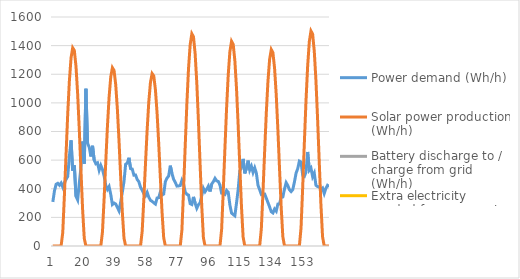
| Category | Power demand (Wh/h) | Solar power production (Wh/h) | Battery discharge to / charge from grid (Wh/h) | Extra electricity needed from generator (Wh/h) |
|---|---|---|---|---|
| 0 | 307.889 | 0 |  |  |
| 1 | 386 | 0 |  |  |
| 2 | 431.333 | 0 |  |  |
| 3 | 438 | 0 |  |  |
| 4 | 424.667 | 0 |  |  |
| 5 | 440.111 | 0 |  |  |
| 6 | 411.667 | 93.6 |  |  |
| 7 | 444.444 | 355.2 |  |  |
| 8 | 465 | 643.2 |  |  |
| 9 | 486.111 | 921.6 |  |  |
| 10 | 627.333 | 1152 |  |  |
| 11 | 737.778 | 1312.8 |  |  |
| 12 | 526.444 | 1384.8 |  |  |
| 13 | 563.556 | 1365.6 |  |  |
| 14 | 346.556 | 1255.2 |  |  |
| 15 | 322.222 | 1063.2 |  |  |
| 16 | 439.444 | 811.2 |  |  |
| 17 | 549.778 | 528 |  |  |
| 18 | 729.778 | 254.4 |  |  |
| 19 | 575.556 | 52.8 |  |  |
| 20 | 1099 | 0 |  |  |
| 21 | 717.222 | 0 |  |  |
| 22 | 690 | 0 |  |  |
| 23 | 625.556 | 0 |  |  |
| 24 | 700.222 | 0 |  |  |
| 25 | 599.667 | 0 |  |  |
| 26 | 574.667 | 0 |  |  |
| 27 | 581 | 0 |  |  |
| 28 | 529.444 | 0 |  |  |
| 29 | 563.222 | 0 |  |  |
| 30 | 534.556 | 98.4 |  |  |
| 31 | 488.889 | 331.2 |  |  |
| 32 | 423.444 | 590.4 |  |  |
| 33 | 395.667 | 835.2 |  |  |
| 34 | 415.111 | 1039.2 |  |  |
| 35 | 360.556 | 1180.8 |  |  |
| 36 | 290 | 1245.6 |  |  |
| 37 | 300.111 | 1226.4 |  |  |
| 38 | 293.222 | 1128 |  |  |
| 39 | 269.889 | 957.6 |  |  |
| 40 | 245.667 | 734.4 |  |  |
| 41 | 307.222 | 484.8 |  |  |
| 42 | 375.889 | 237.6 |  |  |
| 43 | 449.778 | 55.2 |  |  |
| 44 | 571.556 | 0 |  |  |
| 45 | 579.222 | 0 |  |  |
| 46 | 616.444 | 0 |  |  |
| 47 | 540.222 | 0 |  |  |
| 48 | 537.444 | 0 |  |  |
| 49 | 495 | 0 |  |  |
| 50 | 495.778 | 0 |  |  |
| 51 | 464.556 | 0 |  |  |
| 52 | 448.778 | 0 |  |  |
| 53 | 410.333 | 0 |  |  |
| 54 | 390.222 | 103.2 |  |  |
| 55 | 365.222 | 328.8 |  |  |
| 56 | 350.444 | 576 |  |  |
| 57 | 374.556 | 811.2 |  |  |
| 58 | 341.111 | 1008 |  |  |
| 59 | 319 | 1142.4 |  |  |
| 60 | 312.444 | 1204.8 |  |  |
| 61 | 301.444 | 1188 |  |  |
| 62 | 292.778 | 1092 |  |  |
| 63 | 335.222 | 928.8 |  |  |
| 64 | 338 | 715.2 |  |  |
| 65 | 378.556 | 472.8 |  |  |
| 66 | 356 | 237.6 |  |  |
| 67 | 362.889 | 57.6 |  |  |
| 68 | 449.667 | 0 |  |  |
| 69 | 474.667 | 0 |  |  |
| 70 | 488.778 | 0 |  |  |
| 71 | 561.222 | 0 |  |  |
| 72 | 506.222 | 0 |  |  |
| 73 | 466 | 0 |  |  |
| 74 | 444.778 | 0 |  |  |
| 75 | 418.556 | 0 |  |  |
| 76 | 419.667 | 0 |  |  |
| 77 | 422.333 | 0 |  |  |
| 78 | 458.667 | 110.4 |  |  |
| 79 | 432 | 391.2 |  |  |
| 80 | 377.444 | 698.4 |  |  |
| 81 | 361 | 993.6 |  |  |
| 82 | 355.778 | 1238.4 |  |  |
| 83 | 295.667 | 1406.4 |  |  |
| 84 | 289.889 | 1483.2 |  |  |
| 85 | 343 | 1461.6 |  |  |
| 86 | 299 | 1344 |  |  |
| 87 | 263.778 | 1140 |  |  |
| 88 | 288.667 | 871.2 |  |  |
| 89 | 301.333 | 571.2 |  |  |
| 90 | 352.556 | 278.4 |  |  |
| 91 | 402.889 | 57.6 |  |  |
| 92 | 379.222 | 0 |  |  |
| 93 | 396.778 | 0 |  |  |
| 94 | 418.444 | 0 |  |  |
| 95 | 381 | 0 |  |  |
| 96 | 433.111 | 0 |  |  |
| 97 | 449.333 | 0 |  |  |
| 98 | 472.556 | 0 |  |  |
| 99 | 455.111 | 0 |  |  |
| 100 | 450.889 | 0 |  |  |
| 101 | 426 | 0 |  |  |
| 102 | 369.222 | 115.2 |  |  |
| 103 | 366.222 | 384 |  |  |
| 104 | 359.889 | 681.6 |  |  |
| 105 | 388.222 | 962.4 |  |  |
| 106 | 375.667 | 1195.2 |  |  |
| 107 | 287.222 | 1358.4 |  |  |
| 108 | 230.444 | 1430.4 |  |  |
| 109 | 219.889 | 1408.8 |  |  |
| 110 | 211 | 1296 |  |  |
| 111 | 299.444 | 1101.6 |  |  |
| 112 | 394.333 | 844.8 |  |  |
| 113 | 524.222 | 556.8 |  |  |
| 114 | 548.556 | 276 |  |  |
| 115 | 608.667 | 62.4 |  |  |
| 116 | 507.556 | 0 |  |  |
| 117 | 541.889 | 0 |  |  |
| 118 | 596.778 | 0 |  |  |
| 119 | 530.444 | 0 |  |  |
| 120 | 557.333 | 0 |  |  |
| 121 | 514 | 0 |  |  |
| 122 | 546 | 0 |  |  |
| 123 | 509.111 | 0 |  |  |
| 124 | 423.889 | 0 |  |  |
| 125 | 393.111 | 0 |  |  |
| 126 | 360.111 | 120 |  |  |
| 127 | 364 | 376.8 |  |  |
| 128 | 364 | 660 |  |  |
| 129 | 334.222 | 928.8 |  |  |
| 130 | 303.556 | 1149.6 |  |  |
| 131 | 273.556 | 1303.2 |  |  |
| 132 | 239.556 | 1372.8 |  |  |
| 133 | 231.111 | 1351.2 |  |  |
| 134 | 258.333 | 1243.2 |  |  |
| 135 | 243.556 | 1058.4 |  |  |
| 136 | 293 | 813.6 |  |  |
| 137 | 295.444 | 540 |  |  |
| 138 | 339.444 | 271.2 |  |  |
| 139 | 342.778 | 64.8 |  |  |
| 140 | 398.222 | 0 |  |  |
| 141 | 442.556 | 0 |  |  |
| 142 | 422.556 | 0 |  |  |
| 143 | 393 | 0 |  |  |
| 144 | 380.111 | 0 |  |  |
| 145 | 394 | 0 |  |  |
| 146 | 446.889 | 0 |  |  |
| 147 | 509 | 0 |  |  |
| 148 | 540.556 | 0 |  |  |
| 149 | 593.111 | 0 |  |  |
| 150 | 586.778 | 127.2 |  |  |
| 151 | 493.889 | 410.4 |  |  |
| 152 | 486.222 | 720 |  |  |
| 153 | 515.889 | 1015.2 |  |  |
| 154 | 657.111 | 1257.6 |  |  |
| 155 | 529.444 | 1428 |  |  |
| 156 | 544.556 | 1502.4 |  |  |
| 157 | 484.556 | 1480.8 |  |  |
| 158 | 509.556 | 1360.8 |  |  |
| 159 | 424.222 | 1156.8 |  |  |
| 160 | 415.111 | 888 |  |  |
| 161 | 413.222 | 588 |  |  |
| 162 | 396.667 | 292.8 |  |  |
| 163 | 405.333 | 64.8 |  |  |
| 164 | 367.111 | 0 |  |  |
| 165 | 402.333 | 0 |  |  |
| 166 | 423.778 | 0 |  |  |
| 167 | 415.667 | 0 |  |  |